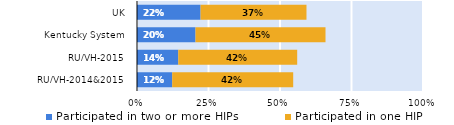
| Category | Participated in two or more HIPs | Participated in one HIP |
|---|---|---|
| RU/VH-2014&2015 | 0.123 | 0.423 |
| RU/VH-2015 | 0.144 | 0.416 |
| Kentucky System | 0.205 | 0.455 |
| UK | 0.222 | 0.37 |